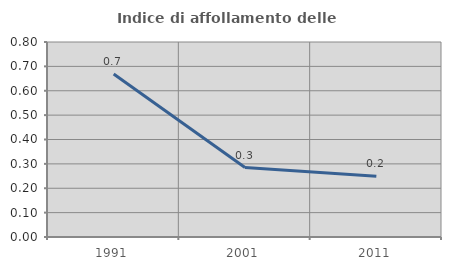
| Category | Indice di affollamento delle abitazioni  |
|---|---|
| 1991.0 | 0.669 |
| 2001.0 | 0.285 |
| 2011.0 | 0.249 |